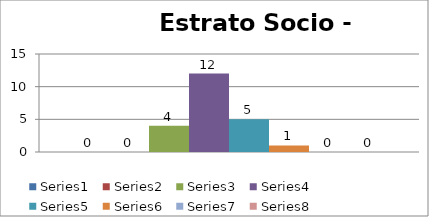
| Category | Series 0 | Series 1 | Series 2 | Series 3 | Series 4 | Series 5 | Series 6 | Series 7 |
|---|---|---|---|---|---|---|---|---|
| 0 | 0 | 0 | 4 | 12 | 5 | 1 | 0 | 0 |